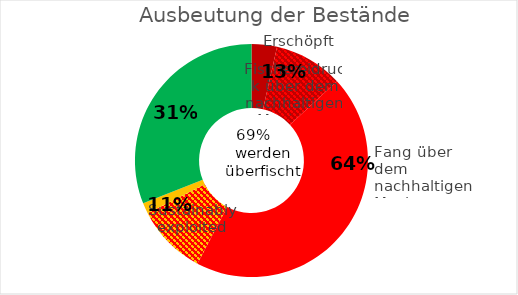
| Category | Series 0 |
|---|---|
| 0 | 14 |
| 1 | 38 |
| 2 | 177 |
| 3 | 39 |
| 4 | 6 |
| 5 | 123 |